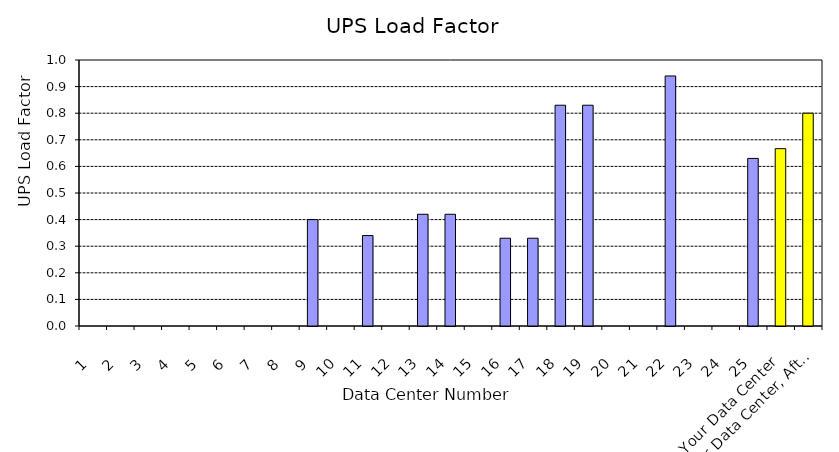
| Category | UPS Load factor |
|---|---|
| 1 | 0 |
| 2 | 0 |
| 3 | 0 |
| 4 | 0 |
| 5 | 0 |
| 6 | 0 |
| 7 | 0 |
| 8 | 0 |
| 9 | 0.4 |
| 10 | 0 |
| 11 | 0.34 |
| 12 | 0 |
| 13 | 0.42 |
| 14 | 0.42 |
| 15 | 0 |
| 16 | 0.33 |
| 17 | 0.33 |
| 18 | 0.83 |
| 19 | 0.83 |
| 20 | 0 |
| 21 | 0 |
| 22 | 0.94 |
| 23 | 0 |
| 24 | 0 |
| 25 | 0.63 |
| Your Data Center | 0.667 |
| Your Data Center, After | 0.8 |